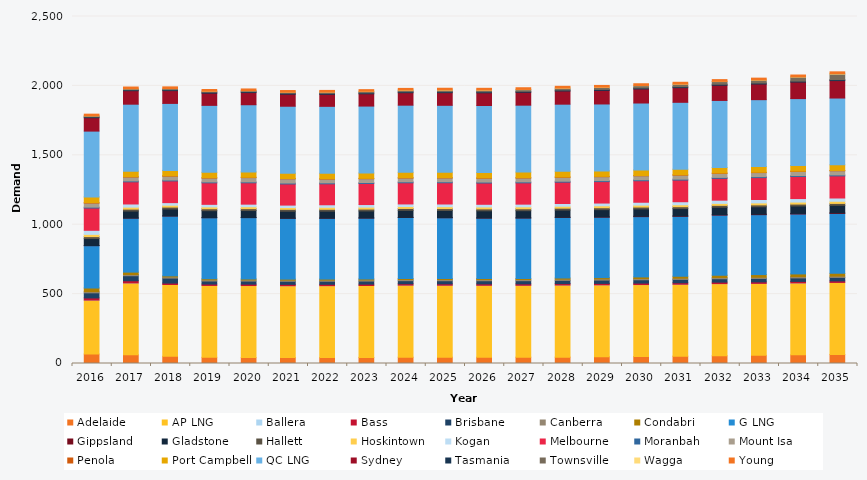
| Category | Adelaide | AP LNG | Ballera | Bass | Brisbane | Canberra | Condabri | G LNG | Gippsland | Gladstone | Hallett | Hoskintown | Kogan | Melbourne | Moranbah | Mount Isa | Penola | Port Campbell | QC LNG | Sydney | Tasmania | Townsville | Wagga | Young |
|---|---|---|---|---|---|---|---|---|---|---|---|---|---|---|---|---|---|---|---|---|---|---|---|---|
| 2016.0 | 68.122 | 388.69 | 0.011 | 15.538 | 36.808 | 8.587 | 26.133 | 305.178 | 0.65 | 50.543 | 13.822 | 16.327 | 29.207 | 160.332 | 6.43 | 29.515 | 2.752 | 41.648 | 474.034 | 96.351 | 6.693 | 6.647 | 0.313 | 12.073 |
| 2017.0 | 62.727 | 517.774 | 0.029 | 15.524 | 36.367 | 8.631 | 17.363 | 389.235 | 0.66 | 50.086 | 13.813 | 14.262 | 22.808 | 159.511 | 6.358 | 28.261 | 2.659 | 39.64 | 482.502 | 97.093 | 6.786 | 7.369 | 0.377 | 12.117 |
| 2018.0 | 51.435 | 517.774 | 0.063 | 9.966 | 36.066 | 8.622 | 7.324 | 431.486 | 0.644 | 49.663 | 13.827 | 13.639 | 18.508 | 156.408 | 6.291 | 28.131 | 2.652 | 38.889 | 482.502 | 92.045 | 6.786 | 7.832 | 0.381 | 12.111 |
| 2019.0 | 44.479 | 517.774 | 0.027 | 9.909 | 22.081 | 8.578 | 7.391 | 440.174 | 0.539 | 50.219 | 13.645 | 13.395 | 18.479 | 154.866 | 6.25 | 28.083 | 2.504 | 38.844 | 482.502 | 87.878 | 6.844 | 7.112 | 0.274 | 12.081 |
| 2020.0 | 42.488 | 519.159 | 0.024 | 9.915 | 22.096 | 8.487 | 7.506 | 441.353 | 0.562 | 50.357 | 13.562 | 14.054 | 18.472 | 153.799 | 6.419 | 30.881 | 2.46 | 38.883 | 483.793 | 87.61 | 6.895 | 6.907 | 0.27 | 12.025 |
| 2021.0 | 42.522 | 517.792 | 0.025 | 9.862 | 22.023 | 8.375 | 7.167 | 438.63 | 0.475 | 50.42 | 13.483 | 13.096 | 17.379 | 152.133 | 6.569 | 30.387 | 2.431 | 38.251 | 482.474 | 86.838 | 6.939 | 7.263 | 0.178 | 11.935 |
| 2022.0 | 42.993 | 517.822 | 0.027 | 9.78 | 21.843 | 8.319 | 7.387 | 438.63 | 0.564 | 50.266 | 13.373 | 14.328 | 18.257 | 150.935 | 6.68 | 27.517 | 2.406 | 39.205 | 482.43 | 86.735 | 6.977 | 8.642 | 0.446 | 11.865 |
| 2023.0 | 44.039 | 517.851 | 0.041 | 9.836 | 22.019 | 8.347 | 7.52 | 438.279 | 0.716 | 50.492 | 13.454 | 13.919 | 18.758 | 151.548 | 6.694 | 27.672 | 2.45 | 38.649 | 482.386 | 88.53 | 7.01 | 9.701 | 1.239 | 11.906 |
| 2024.0 | 45.205 | 519.267 | 0.061 | 9.919 | 22.299 | 8.428 | 7.236 | 439.452 | 0.903 | 50.759 | 13.549 | 13.977 | 18.496 | 152.471 | 6.715 | 27.367 | 2.486 | 38.88 | 483.633 | 89.945 | 7.038 | 10.246 | 1.666 | 11.999 |
| 2025.0 | 45.788 | 517.911 | 0.063 | 10.011 | 22.586 | 8.506 | 7.663 | 437.571 | 1.146 | 51.033 | 13.665 | 13.856 | 19.322 | 153.146 | 6.737 | 27.579 | 2.487 | 38.757 | 482.298 | 91.083 | 7.061 | 10.788 | 1.955 | 12.087 |
| 2026.0 | 45.324 | 517.94 | 0.067 | 10.08 | 22.856 | 8.584 | 7.425 | 435.47 | 1.124 | 51.291 | 13.645 | 13.92 | 19.3 | 153.292 | 6.756 | 27.768 | 2.519 | 39.05 | 482.255 | 91.686 | 7.079 | 11.1 | 1.924 | 12.173 |
| 2027.0 | 45.341 | 517.97 | 0.071 | 10.144 | 23.144 | 8.658 | 7.51 | 435.47 | 1.092 | 51.577 | 13.631 | 14.149 | 19.337 | 153.452 | 6.778 | 27.984 | 2.514 | 40.124 | 482.211 | 92.759 | 7.092 | 11.815 | 1.706 | 12.256 |
| 2028.0 | 45.873 | 519.385 | 0.065 | 10.215 | 23.435 | 8.735 | 7.97 | 436.636 | 1.39 | 51.881 | 13.61 | 13.96 | 19.51 | 153.661 | 6.801 | 28.196 | 2.508 | 41.014 | 483.457 | 95.034 | 7.1 | 12.779 | 1.396 | 12.343 |
| 2029.0 | 48.616 | 518.029 | 0.104 | 10.296 | 23.733 | 8.82 | 9.246 | 435.47 | 1.928 | 52.183 | 13.628 | 14.28 | 19.684 | 154.45 | 6.826 | 28.398 | 2.527 | 39.443 | 482.123 | 97.798 | 7.106 | 14.615 | 1.644 | 12.435 |
| 2030.0 | 50.546 | 518.058 | 0.144 | 10.389 | 24.038 | 8.911 | 11.534 | 434.501 | 2.922 | 52.483 | 13.639 | 13.821 | 20.79 | 154.935 | 6.852 | 28.608 | 2.448 | 40.033 | 482.079 | 101.426 | 7.109 | 16.368 | 1.397 | 12.533 |
| 2031.0 | 52.701 | 518.088 | 0.185 | 10.484 | 24.344 | 9.004 | 13.772 | 431.623 | 3.016 | 52.812 | 13.629 | 13.973 | 21.882 | 155.79 | 6.878 | 28.82 | 2.418 | 40.339 | 482.035 | 105.398 | 7.111 | 17.834 | 1.326 | 12.632 |
| 2032.0 | 55.776 | 519.504 | 0.23 | 10.568 | 24.655 | 9.096 | 16.312 | 432.778 | 3.708 | 53.148 | 13.69 | 14.01 | 23.354 | 156.977 | 6.905 | 29.036 | 2.435 | 39.774 | 483.281 | 109.44 | 7.113 | 19.412 | 1.396 | 12.731 |
| 2033.0 | 58.638 | 518.147 | 0.279 | 10.653 | 24.967 | 9.187 | 18.781 | 431.623 | 3.472 | 53.465 | 13.672 | 14.087 | 24.776 | 157.474 | 6.933 | 29.254 | 2.428 | 41.034 | 481.947 | 112.705 | 7.114 | 20.906 | 1.594 | 12.827 |
| 2034.0 | 62.177 | 518.177 | 0.263 | 10.741 | 25.288 | 9.279 | 19.421 | 431.623 | 4.243 | 53.798 | 13.713 | 14.28 | 25.335 | 158.637 | 6.977 | 29.484 | 2.453 | 40.725 | 481.903 | 118.934 | 7.114 | 29.126 | 1.824 | 12.927 |
| 2035.0 | 65.55 | 518.206 | 0.209 | 10.828 | 25.611 | 9.372 | 19.621 | 431.623 | 4.428 | 54.172 | 13.73 | 15.458 | 23.593 | 159.237 | 7.023 | 29.715 | 2.447 | 40.328 | 481.453 | 125.57 | 7.113 | 39.743 | 3.251 | 13.026 |